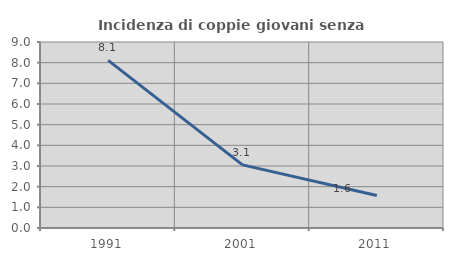
| Category | Incidenza di coppie giovani senza figli |
|---|---|
| 1991.0 | 8.108 |
| 2001.0 | 3.053 |
| 2011.0 | 1.575 |